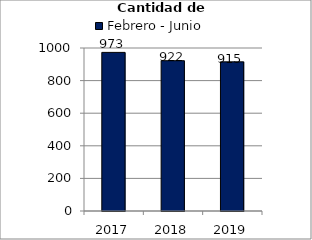
| Category | Febrero - Junio |
|---|---|
| 2017.0 | 973 |
| 2018.0 | 922 |
| 2019.0 | 915 |